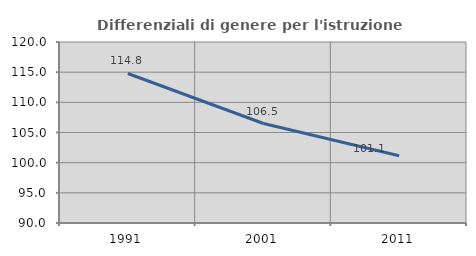
| Category | Differenziali di genere per l'istruzione superiore |
|---|---|
| 1991.0 | 114.784 |
| 2001.0 | 106.487 |
| 2011.0 | 101.145 |